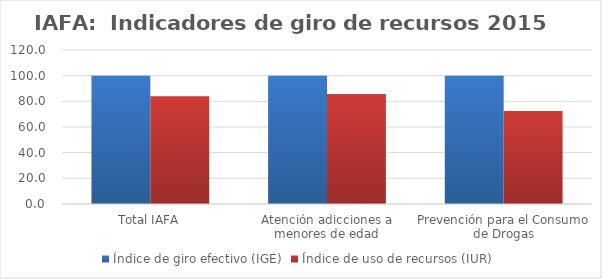
| Category | Índice de giro efectivo (IGE) | Índice de uso de recursos (IUR)  |
|---|---|---|
| Total IAFA | 100 | 83.901 |
| Atención adicciones a menores de edad | 100 | 85.718 |
| Prevención para el Consumo de Drogas | 100 | 72.401 |